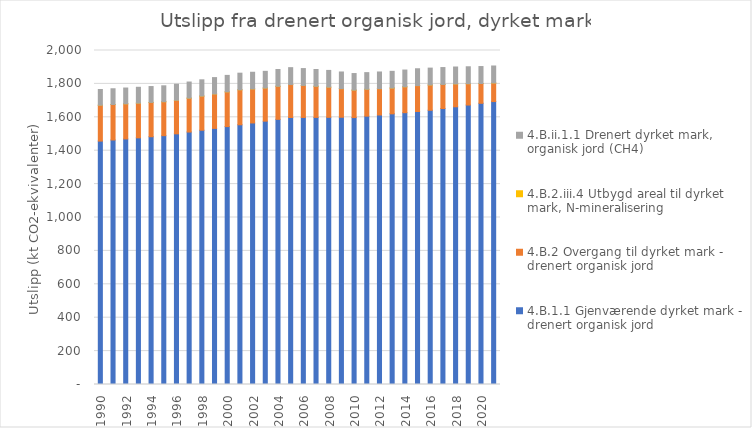
| Category | 4.B.1.1 Gjenværende dyrket mark - drenert organisk jord | 4.B.2 Overgang til dyrket mark - drenert organisk jord | 4.B.2.iii.4 Utbygd areal til dyrket mark, N-mineralisering | 4.B.ii.1.1 Drenert dyrket mark, organisk jord (CH4) |
|---|---|---|---|---|
| 1990.0 | 1457.528 | 214.8 | 0.034 | 94.162 |
| 1991.0 | 1464.035 | 212.459 | 0.04 | 94.397 |
| 1992.0 | 1470.541 | 210.117 | 0.048 | 94.631 |
| 1993.0 | 1477.047 | 207.775 | 0.056 | 94.866 |
| 1994.0 | 1483.553 | 205.434 | 0.061 | 95.1 |
| 1995.0 | 1490.059 | 203.092 | 0.069 | 95.335 |
| 1996.0 | 1500.916 | 201.186 | 0.077 | 95.839 |
| 1997.0 | 1511.773 | 202.859 | 0.074 | 96.544 |
| 1998.0 | 1522.63 | 204.533 | 0.074 | 97.25 |
| 1999.0 | 1533.487 | 206.207 | 0.072 | 97.955 |
| 2000.0 | 1544.344 | 207.881 | 0.072 | 98.661 |
| 2001.0 | 1555.202 | 209.554 | 0.069 | 99.366 |
| 2002.0 | 1566.059 | 203.918 | 0.069 | 99.66 |
| 2003.0 | 1576.916 | 198.282 | 0.066 | 99.954 |
| 2004.0 | 1587.773 | 197.868 | 0.066 | 100.542 |
| 2005.0 | 1598.63 | 197.453 | 0.064 | 101.13 |
| 2006.0 | 1599.045 | 191.817 | 0.064 | 100.836 |
| 2007.0 | 1599.459 | 186.181 | 0.061 | 100.542 |
| 2008.0 | 1599.874 | 180.545 | 0.077 | 100.248 |
| 2009.0 | 1600.289 | 171.254 | 0.093 | 99.749 |
| 2010.0 | 1598.362 | 164.305 | 0.101 | 99.249 |
| 2011.0 | 1606.878 | 161.011 | 0.109 | 99.543 |
| 2012.0 | 1613.827 | 157.717 | 0.117 | 99.749 |
| 2013.0 | 1620.776 | 154.422 | 0.109 | 99.954 |
| 2014.0 | 1627.725 | 154.783 | 0.101 | 100.366 |
| 2015.0 | 1634.674 | 155.143 | 0.09 | 100.778 |
| 2016.0 | 1642.058 | 151.414 | 0.082 | 100.983 |
| 2017.0 | 1652.501 | 144.104 | 0.082 | 101.16 |
| 2018.0 | 1662.943 | 136.795 | 0.09 | 101.336 |
| 2019.0 | 1673.385 | 127.658 | 0.098 | 101.41 |
| 2020.0 | 1683.828 | 118.521 | 0.106 | 101.483 |
| 2021.0 | 1694.27 | 111.211 | 0.114 | 101.66 |